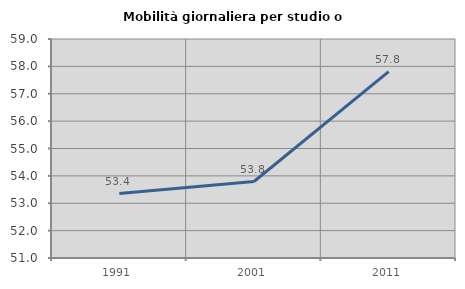
| Category | Mobilità giornaliera per studio o lavoro |
|---|---|
| 1991.0 | 53.356 |
| 2001.0 | 53.793 |
| 2011.0 | 57.806 |